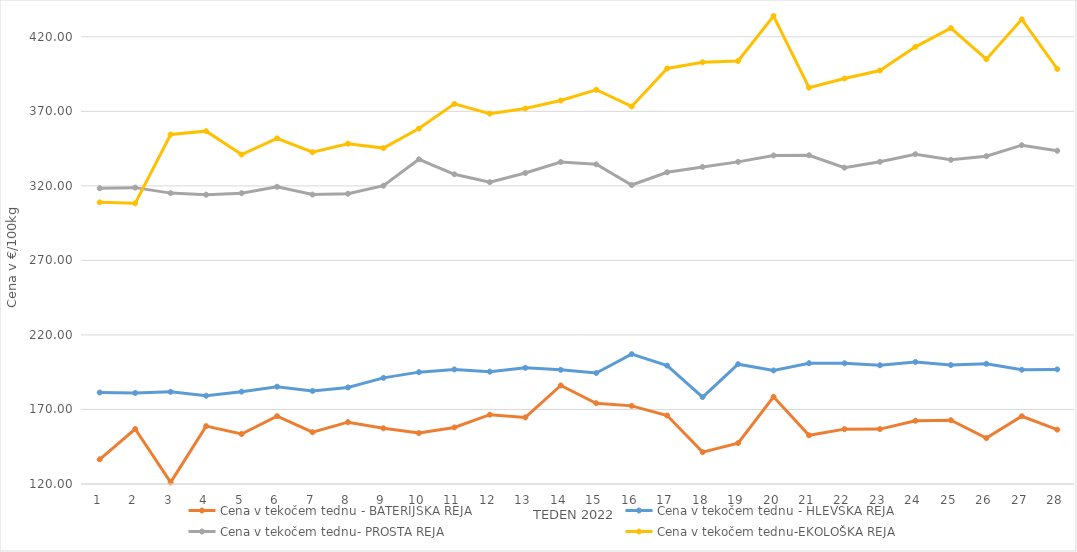
| Category | Cena v tekočem tednu - BATERIJSKA REJA | Cena v tekočem tednu - HLEVSKA REJA | Cena v tekočem tednu- PROSTA REJA | Cena v tekočem tednu-EKOLOŠKA REJA |
|---|---|---|---|---|
| 1.0 | 136.59 | 181.38 | 318.4 | 308.97 |
| 2.0 | 156.88 | 181.07 | 318.82 | 308.28 |
| 3.0 | 121.07 | 181.83 | 315.14 | 354.48 |
| 4.0 | 158.82 | 179.22 | 314.08 | 356.72 |
| 5.0 | 153.55 | 181.96 | 315.1 | 341.03 |
| 6.0 | 165.51 | 185.31 | 319.38 | 351.9 |
| 7.0 | 154.74 | 182.45 | 314.16 | 342.59 |
| 8.0 | 161.48 | 184.77 | 314.71 | 348.28 |
| 9.0 | 157.38 | 191.21 | 320.1 | 345.35 |
| 10.0 | 154.16 | 195.04 | 337.83 | 358.45 |
| 11.0 | 157.96 | 196.88 | 327.79 | 375 |
| 12.0 | 166.49 | 195.36 | 322.46 | 368.45 |
| 13.0 | 164.66 | 197.95 | 328.67 | 371.9 |
| 14.0 | 186.11 | 196.59 | 336.02 | 377.24 |
| 15.0 | 174.18 | 194.49 | 334.46 | 384.48 |
| 16.0 | 172.42 | 207.1 | 320.58 | 373.28 |
| 17.0 | 165.96 | 199.41 | 329.11 | 398.79 |
| 18.0 | 141.36 | 178.29 | 332.71 | 402.93 |
| 19.0 | 147.43 | 200.37 | 336.11 | 403.79 |
| 20.0 | 178.51 | 196.16 | 340.4 | 433.97 |
| 21.0 | 152.67 | 201.05 | 340.55 | 385.86 |
| 22.0 | 156.8 | 200.98 | 332.23 | 392.07 |
| 23.0 | 156.84 | 199.63 | 336.16 | 397.41 |
| 24.0 | 162.44 | 201.86 | 341.24 | 413.28 |
| 25.0 | 162.78 | 199.81 | 337.48 | 425.86 |
| 26.0 | 150.82 | 200.65 | 339.9 | 405 |
| 27.0 | 165.45 | 196.64 | 347.3 | 431.72 |
| 28.0 | 156.46 | 196.88 | 343.56 | 398.45 |